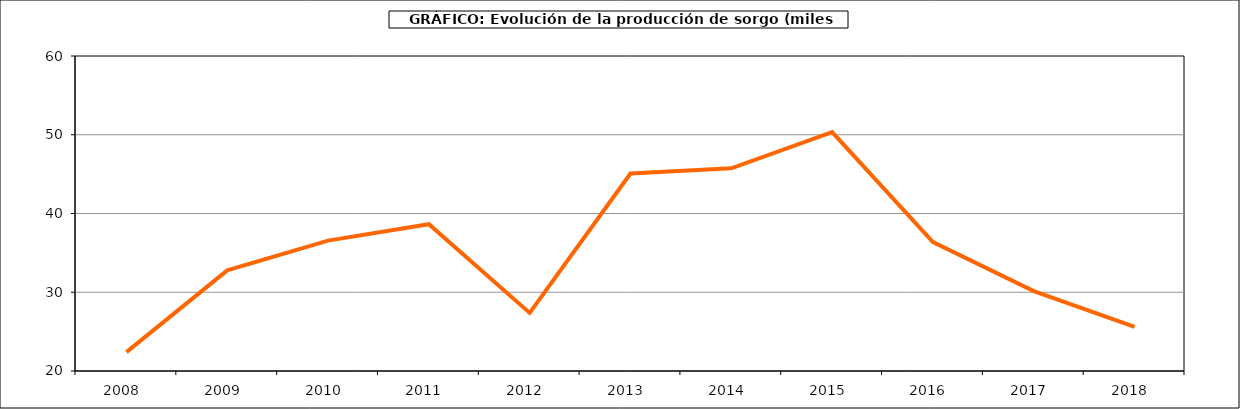
| Category | Producción |
|---|---|
| 2008.0 | 22.397 |
| 2009.0 | 32.782 |
| 2010.0 | 36.561 |
| 2011.0 | 38.643 |
| 2012.0 | 27.38 |
| 2013.0 | 45.085 |
| 2014.0 | 45.744 |
| 2015.0 | 50.335 |
| 2016.0 | 36.361 |
| 2017.0 | 30.138 |
| 2018.0 | 25.589 |